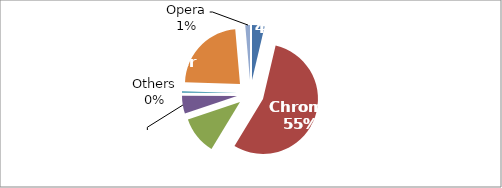
| Category | Series 0 |
|---|---|
| Safari | 0.037 |
| Chrome | 0.55 |
| Firefox | 0.111 |
| Microsoft Edge | 0.053 |
| Others | 0.004 |
| Microsoft Internet Explorer | 0.231 |
| Opera | 0.014 |